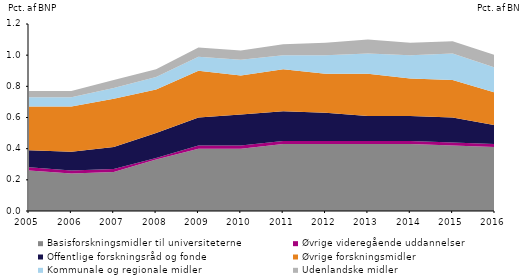
| Category | Basisforskningsmidler til universiteterne | Øvrige videregående uddannelser | Offentlige forskningsråd og fonde | Øvrige forskningsmidler | Kommunale og regionale midler | Udenlandske midler |
|---|---|---|---|---|---|---|
| 2005.0 | 0.26 | 0.02 | 0.11 | 0.28 | 0.06 | 0.04 |
| 2006.0 | 0.24 | 0.02 | 0.12 | 0.29 | 0.06 | 0.04 |
| 2007.0 | 0.25 | 0.02 | 0.14 | 0.31 | 0.07 | 0.05 |
| 2008.0 | 0.33 | 0.01 | 0.16 | 0.28 | 0.08 | 0.05 |
| 2009.0 | 0.4 | 0.02 | 0.18 | 0.3 | 0.09 | 0.06 |
| 2010.0 | 0.4 | 0.02 | 0.2 | 0.25 | 0.1 | 0.06 |
| 2011.0 | 0.43 | 0.02 | 0.19 | 0.27 | 0.09 | 0.07 |
| 2012.0 | 0.43 | 0.02 | 0.18 | 0.25 | 0.12 | 0.08 |
| 2013.0 | 0.43 | 0.02 | 0.16 | 0.27 | 0.13 | 0.09 |
| 2014.0 | 0.43 | 0.02 | 0.16 | 0.24 | 0.15 | 0.08 |
| 2015.0 | 0.42 | 0.02 | 0.16 | 0.24 | 0.17 | 0.08 |
| 2016.0 | 0.41 | 0.02 | 0.12 | 0.21 | 0.16 | 0.08 |